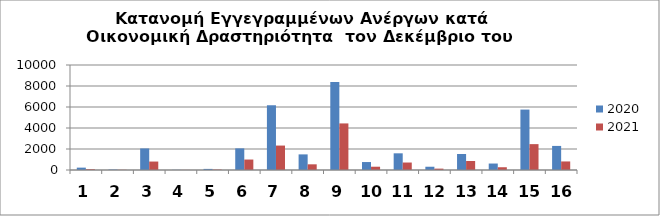
| Category | 2020 | 2021 |
|---|---|---|
| 0 | 225 | 75 |
| 1 | 42 | 19 |
| 2 | 2052 | 805 |
| 3 | 15 | 9 |
| 4 | 105 | 41 |
| 5 | 2060 | 996 |
| 6 | 6166 | 2327 |
| 7 | 1487 | 541 |
| 8 | 8383 | 4436 |
| 9 | 758 | 313 |
| 10 | 1589 | 712 |
| 11 | 311 | 130 |
| 12 | 1526 | 855 |
| 13 | 616 | 263 |
| 14 | 5754 | 2464 |
| 15 | 2293 | 814 |